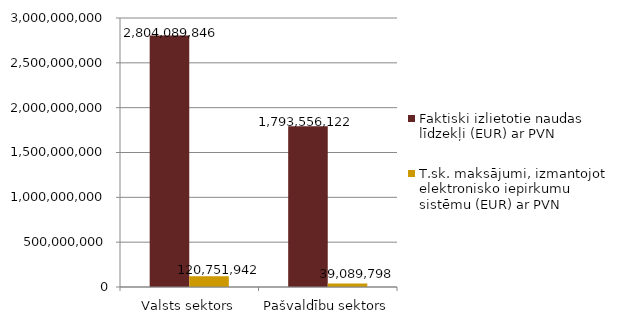
| Category | Faktiski izlietotie naudas līdzekļi (EUR) ar PVN | T.sk. maksājumi, izmantojot elektronisko iepirkumu sistēmu (EUR) ar PVN |
|---|---|---|
| Valsts sektors | 2804089846 | 120751942 |
| Pašvaldību sektors | 1793556122 | 39089798 |